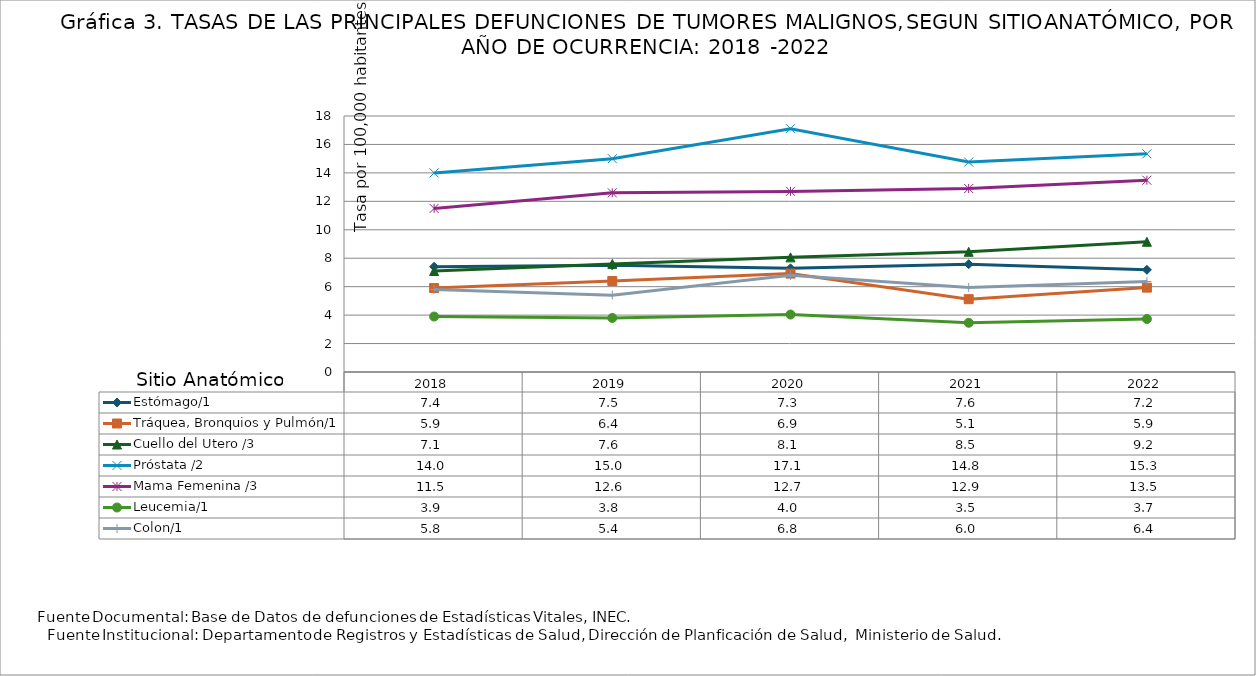
| Category | Estómago/1 | Tráquea, Bronquios y Pulmón/1 | Cuello del Utero /3 | Próstata /2 | Mama Femenina /3 | Leucemia/1 | Colon/1 |
|---|---|---|---|---|---|---|---|
| 2018.0 | 7.4 | 5.9 | 7.1 | 14 | 11.5 | 3.9 | 5.8 |
| 2019.0 | 7.5 | 6.4 | 7.6 | 15 | 12.599 | 3.8 | 5.404 |
| 2020.0 | 7.29 | 6.92 | 8.06 | 17.11 | 12.7 | 4.04 | 6.8 |
| 2021.0 | 7.58 | 5.12 | 8.45 | 14.76 | 12.9 | 3.46 | 5.95 |
| 2022.0 | 7.184 | 5.934 | 9.157 | 15.338 | 13.485 | 3.728 | 6.365 |